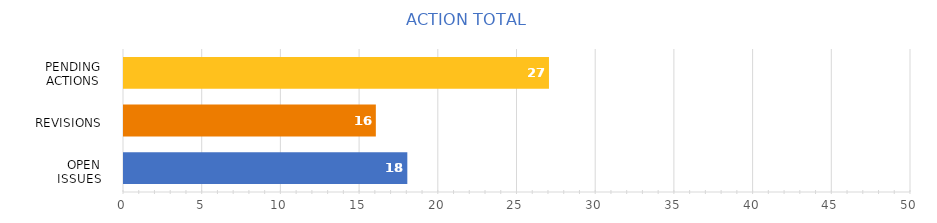
| Category | Series 0 |
|---|---|
| 0 | 18 |
| 1 | 16 |
| 2 | 27 |